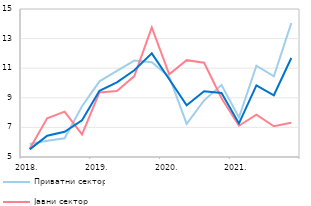
| Category | Приватни сектор | Јавни сектор | Укупна зарада |
|---|---|---|---|
| 2018. | 5.872 | 5.562 | 5.513 |
| II | 6.102 | 7.617 | 6.439 |
| III | 6.267 | 8.063 | 6.703 |
| IV | 8.427 | 6.522 | 7.476 |
| 2019. | 10.114 | 9.362 | 9.473 |
| II | 10.825 | 9.459 | 10.044 |
| III | 11.513 | 10.466 | 10.865 |
| IV | 11.406 | 13.749 | 12 |
| 2020. | 10.428 | 10.588 | 10.257 |
| II | 7.243 | 11.542 | 8.497 |
| III | 8.828 | 11.371 | 9.447 |
| IV | 9.866 | 8.967 | 9.324 |
| 2021. | 7.664 | 7.113 | 7.271 |
| II | 11.171 | 7.863 | 9.844 |
| III | 10.45 | 7.078 | 9.172 |
| IV* | 14.046 | 7.308 | 11.69 |